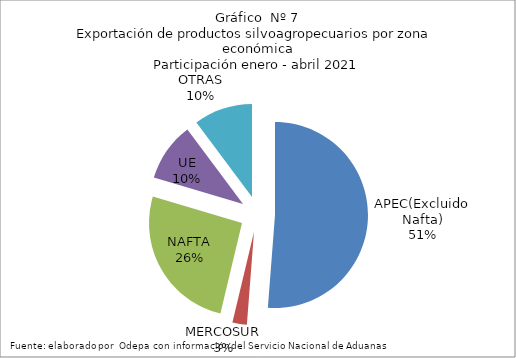
| Category | Series 0 |
|---|---|
| APEC(Excluido Nafta) | 3363163.874 |
| MERCOSUR | 164680.38 |
| NAFTA | 1697839.729 |
| UE | 670516.146 |
| OTRAS | 669685.871 |